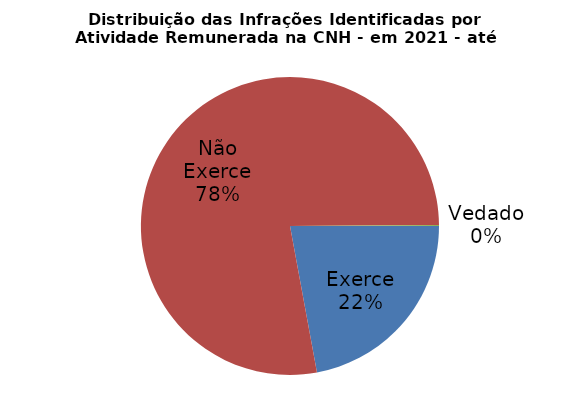
| Category | Series 0 |
|---|---|
| Exerce | 0.221 |
| Não Exerce | 0.778 |
| Vedado | 0.001 |